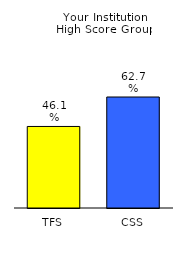
| Category | Series 0 |
|---|---|
| TFS | 0.461 |
| CSS | 0.627 |